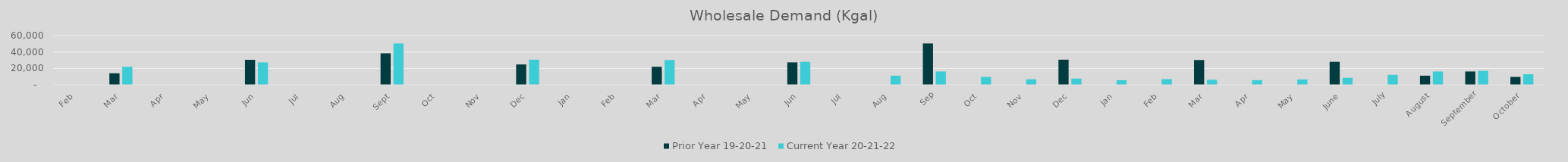
| Category | Prior Year 19-20-21 | Current Year 20-21-22 |
|---|---|---|
| Feb | 0 | 0 |
| Mar | 14013.78 | 21965.02 |
| Apr | 0 | 0 |
| May | 0 | 0 |
| Jun | 30443.6 | 27331 |
| Jul | 0 | 0 |
| Aug | 0 | 0 |
| Sep | 38376.14 | 50400.24 |
| Oct | 0 | 0 |
| Nov | 0 | 0 |
| Dec | 24784.98 | 30611.9 |
| Jan | 0 | 0 |
| Feb | 0 | 0 |
| Mar | 21965.02 | 30196.76 |
| Apr | 0 | 0 |
| May | 0 | 0 |
| Jun | 27331 | 27993.9 |
| Jul | 0 | 0 |
| Aug | 0 | 11056.179 |
| Sep | 50400.24 | 16202.763 |
| Oct | 0 | 9585.62 |
| Nov | 0 | 6754.44 |
| Dec | 30611.9 | 7547.32 |
| Jan | 0 | 5643.66 |
| Feb | 0 | 6907.78 |
| Mar | 30196.76 | 6111.16 |
| Apr | 0 | 5707.24 |
| May | 0 | 6522.56 |
| June | 27993.9 | 8549.64 |
| July | 0 | 12192.4 |
| August | 11056.179 | 16164.28 |
| September | 16202.763 | 17013.35 |
| October | 9585.62 | 12849.024 |